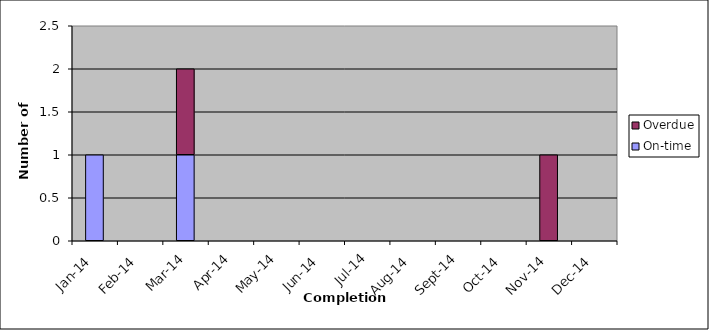
| Category | On-time | Overdue |
|---|---|---|
| 2014-01-01 | 1 | 0 |
| 2014-02-01 | 0 | 0 |
| 2014-03-01 | 1 | 1 |
| 2014-04-01 | 0 | 0 |
| 2014-05-01 | 0 | 0 |
| 2014-06-01 | 0 | 0 |
| 2014-07-01 | 0 | 0 |
| 2014-08-01 | 0 | 0 |
| 2014-09-01 | 0 | 0 |
| 2014-10-01 | 0 | 0 |
| 2014-11-01 | 0 | 1 |
| 2014-12-01 | 0 | 0 |